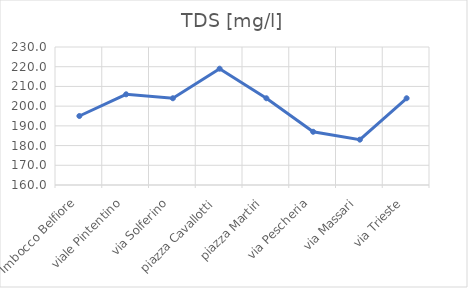
| Category | TDS [mg/l] |
|---|---|
| Imbocco Belfiore | 195 |
| viale Pintentino | 206 |
| via Solferino | 204 |
| piazza Cavallotti | 219 |
| piazza Martiri | 204 |
| via Pescheria | 187 |
| via Massari | 183 |
| via Trieste | 204 |